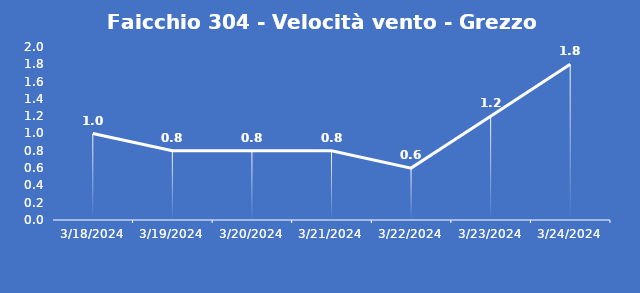
| Category | Faicchio 304 - Velocità vento - Grezzo (m/s) |
|---|---|
| 3/18/24 | 1 |
| 3/19/24 | 0.8 |
| 3/20/24 | 0.8 |
| 3/21/24 | 0.8 |
| 3/22/24 | 0.6 |
| 3/23/24 | 1.2 |
| 3/24/24 | 1.8 |